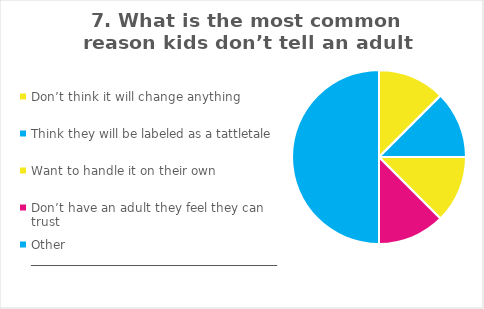
| Category | Field1 |
|---|---|
| Don’t think it will change anything | 1 |
| Think they will be labeled as a tattletale | 1 |
| Want to handle it on their own | 1 |
| Don’t have an adult they feel they can trust | 1 |
| Other _________________________________________ | 4 |